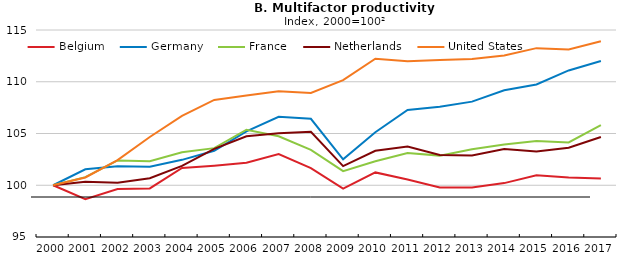
| Category | Belgium | Germany | France | Netherlands | United States |
|---|---|---|---|---|---|
| 2000.0 | 100 | 100 | 100 | 100 | 100 |
| 2001.0 | 98.647 | 101.547 | 100.785 | 100.334 | 100.749 |
| 2002.0 | 99.644 | 101.838 | 102.396 | 100.25 | 102.423 |
| 2003.0 | 99.689 | 101.781 | 102.315 | 100.677 | 104.664 |
| 2004.0 | 101.674 | 102.454 | 103.179 | 101.878 | 106.695 |
| 2005.0 | 101.892 | 103.333 | 103.584 | 103.52 | 108.24 |
| 2006.0 | 102.167 | 105.201 | 105.368 | 104.727 | 108.67 |
| 2007.0 | 103.014 | 106.61 | 104.737 | 105.019 | 109.085 |
| 2008.0 | 101.657 | 106.421 | 103.41 | 105.169 | 108.91 |
| 2009.0 | 99.672 | 102.507 | 101.365 | 101.849 | 110.16 |
| 2010.0 | 101.24 | 105.121 | 102.313 | 103.333 | 112.219 |
| 2011.0 | 100.56 | 107.271 | 103.112 | 103.743 | 111.976 |
| 2012.0 | 99.788 | 107.583 | 102.863 | 102.925 | 112.11 |
| 2013.0 | 99.784 | 108.08 | 103.482 | 102.875 | 112.194 |
| 2014.0 | 100.208 | 109.183 | 103.932 | 103.512 | 112.542 |
| 2015.0 | 100.966 | 109.742 | 104.272 | 103.266 | 113.247 |
| 2016.0 | 100.756 | 111.092 | 104.131 | 103.628 | 113.116 |
| 2017.0 | 100.644 | 112.01 | 105.813 | 104.665 | 113.908 |